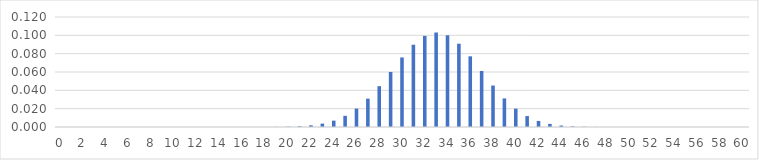
| Category | Series 0 |
|---|---|
| 0.0 | 0 |
| 1.0 | 0 |
| 2.0 | 0 |
| 3.0 | 0 |
| 4.0 | 0 |
| 5.0 | 0 |
| 6.0 | 0 |
| 7.0 | 0 |
| 8.0 | 0 |
| 9.0 | 0 |
| 10.0 | 0 |
| 11.0 | 0 |
| 12.0 | 0 |
| 13.0 | 0 |
| 14.0 | 0 |
| 15.0 | 0 |
| 16.0 | 0 |
| 17.0 | 0 |
| 18.0 | 0 |
| 19.0 | 0 |
| 20.0 | 0 |
| 21.0 | 0.001 |
| 22.0 | 0.002 |
| 23.0 | 0.004 |
| 24.0 | 0.007 |
| 25.0 | 0.012 |
| 26.0 | 0.02 |
| 27.0 | 0.031 |
| 28.0 | 0.045 |
| 29.0 | 0.06 |
| 30.0 | 0.076 |
| 31.0 | 0.09 |
| 32.0 | 0.099 |
| 33.0 | 0.103 |
| 34.0 | 0.1 |
| 35.0 | 0.091 |
| 36.0 | 0.077 |
| 37.0 | 0.061 |
| 38.0 | 0.045 |
| 39.0 | 0.031 |
| 40.0 | 0.02 |
| 41.0 | 0.012 |
| 42.0 | 0.007 |
| 43.0 | 0.003 |
| 44.0 | 0.002 |
| 45.0 | 0.001 |
| 46.0 | 0 |
| 47.0 | 0 |
| 48.0 | 0 |
| 49.0 | 0 |
| 50.0 | 0 |
| 51.0 | 0 |
| 52.0 | 0 |
| 53.0 | 0 |
| 54.0 | 0 |
| 55.0 | 0 |
| 56.0 | 0 |
| 57.0 | 0 |
| 58.0 | 0 |
| 59.0 | 0 |
| 60.0 | 0 |